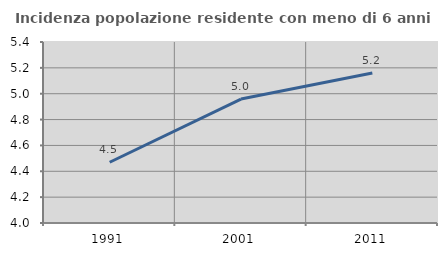
| Category | Incidenza popolazione residente con meno di 6 anni |
|---|---|
| 1991.0 | 4.47 |
| 2001.0 | 4.959 |
| 2011.0 | 5.16 |